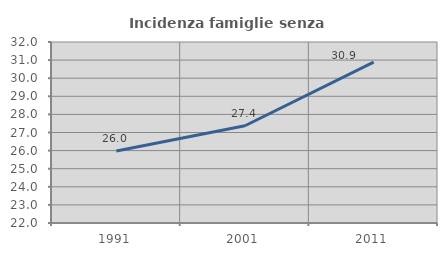
| Category | Incidenza famiglie senza nuclei |
|---|---|
| 1991.0 | 25.982 |
| 2001.0 | 27.374 |
| 2011.0 | 30.89 |